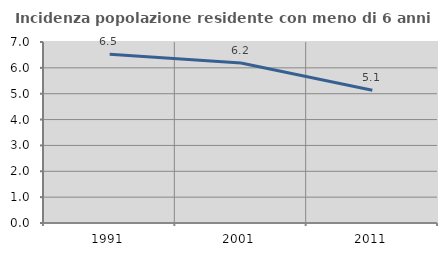
| Category | Incidenza popolazione residente con meno di 6 anni |
|---|---|
| 1991.0 | 6.528 |
| 2001.0 | 6.188 |
| 2011.0 | 5.137 |